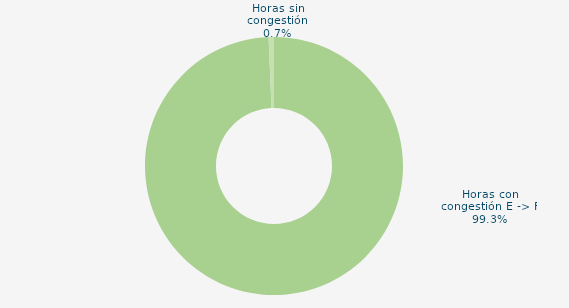
| Category | Horas con congestión E -> F |
|---|---|
| Horas con congestión E -> F | 99.328 |
| Horas con congestión F -> E | 0 |
| Horas sin congestión | 0.672 |